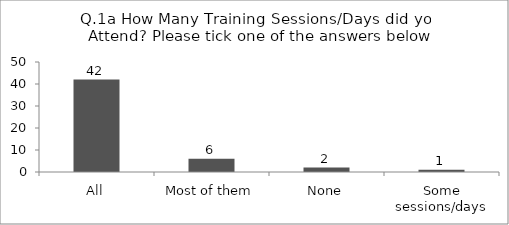
| Category | Q.1a How Many Training Sessions/Days did you Attend? Please tick one of the answers below |
|---|---|
| All | 42 |
| Most of them | 6 |
| None | 2 |
| Some sessions/days | 1 |